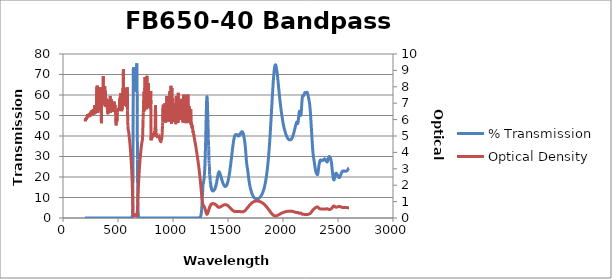
| Category | % Transmission |
|---|---|
| 2600.0 | 24.378 |
| 2599.0 | 24.358 |
| 2598.0 | 24.295 |
| 2597.0 | 24.212 |
| 2596.0 | 24.119 |
| 2595.0 | 24.054 |
| 2594.0 | 23.983 |
| 2593.0 | 23.907 |
| 2592.0 | 23.822 |
| 2591.0 | 23.744 |
| 2590.0 | 23.647 |
| 2589.0 | 23.537 |
| 2588.0 | 23.453 |
| 2587.0 | 23.376 |
| 2586.0 | 23.321 |
| 2585.0 | 23.246 |
| 2584.0 | 23.156 |
| 2583.0 | 23.119 |
| 2582.0 | 23.045 |
| 2581.0 | 23.02 |
| 2580.0 | 22.973 |
| 2579.0 | 22.931 |
| 2578.0 | 22.893 |
| 2577.0 | 22.862 |
| 2576.0 | 22.856 |
| 2575.0 | 22.855 |
| 2574.0 | 22.839 |
| 2573.0 | 22.817 |
| 2572.0 | 22.823 |
| 2571.0 | 22.839 |
| 2570.0 | 22.827 |
| 2569.0 | 22.824 |
| 2568.0 | 22.842 |
| 2567.0 | 22.84 |
| 2566.0 | 22.818 |
| 2565.0 | 22.806 |
| 2564.0 | 22.795 |
| 2563.0 | 22.834 |
| 2562.0 | 22.836 |
| 2561.0 | 22.842 |
| 2560.0 | 22.866 |
| 2559.0 | 22.865 |
| 2558.0 | 22.925 |
| 2557.0 | 22.911 |
| 2556.0 | 22.906 |
| 2555.0 | 22.902 |
| 2554.0 | 22.909 |
| 2553.0 | 22.852 |
| 2552.0 | 22.878 |
| 2551.0 | 22.9 |
| 2550.0 | 22.92 |
| 2549.0 | 22.937 |
| 2548.0 | 22.905 |
| 2547.0 | 22.926 |
| 2546.0 | 22.928 |
| 2545.0 | 22.931 |
| 2544.0 | 22.917 |
| 2543.0 | 22.892 |
| 2542.0 | 22.882 |
| 2541.0 | 22.836 |
| 2540.0 | 22.826 |
| 2539.0 | 22.757 |
| 2538.0 | 22.673 |
| 2537.0 | 22.585 |
| 2536.0 | 22.52 |
| 2535.0 | 22.4 |
| 2534.0 | 22.285 |
| 2533.0 | 22.171 |
| 2532.0 | 22.087 |
| 2531.0 | 21.934 |
| 2530.0 | 21.81 |
| 2529.0 | 21.665 |
| 2528.0 | 21.497 |
| 2527.0 | 21.329 |
| 2526.0 | 21.18 |
| 2525.0 | 21.031 |
| 2524.0 | 20.87 |
| 2523.0 | 20.737 |
| 2522.0 | 20.592 |
| 2521.0 | 20.459 |
| 2520.0 | 20.315 |
| 2519.0 | 20.189 |
| 2518.0 | 20.079 |
| 2517.0 | 19.974 |
| 2516.0 | 19.886 |
| 2515.0 | 19.852 |
| 2514.0 | 19.778 |
| 2513.0 | 19.737 |
| 2512.0 | 19.726 |
| 2511.0 | 19.712 |
| 2510.0 | 19.719 |
| 2509.0 | 19.75 |
| 2508.0 | 19.771 |
| 2507.0 | 19.823 |
| 2506.0 | 19.893 |
| 2505.0 | 19.991 |
| 2504.0 | 20.06 |
| 2503.0 | 20.154 |
| 2502.0 | 20.272 |
| 2501.0 | 20.374 |
| 2500.0 | 20.478 |
| 2499.0 | 20.581 |
| 2498.0 | 20.702 |
| 2497.0 | 20.781 |
| 2496.0 | 20.891 |
| 2495.0 | 20.991 |
| 2494.0 | 21.096 |
| 2493.0 | 21.192 |
| 2492.0 | 21.298 |
| 2491.0 | 21.382 |
| 2490.0 | 21.456 |
| 2489.0 | 21.557 |
| 2488.0 | 21.64 |
| 2487.0 | 21.694 |
| 2486.0 | 21.761 |
| 2485.0 | 21.833 |
| 2484.0 | 21.852 |
| 2483.0 | 21.881 |
| 2482.0 | 21.888 |
| 2481.0 | 21.847 |
| 2480.0 | 21.781 |
| 2479.0 | 21.716 |
| 2478.0 | 21.596 |
| 2477.0 | 21.432 |
| 2476.0 | 21.277 |
| 2475.0 | 21.057 |
| 2474.0 | 20.819 |
| 2473.0 | 20.6 |
| 2472.0 | 20.331 |
| 2471.0 | 20.071 |
| 2470.0 | 19.803 |
| 2469.0 | 19.543 |
| 2468.0 | 19.3 |
| 2467.0 | 19.059 |
| 2466.0 | 18.877 |
| 2465.0 | 18.728 |
| 2464.0 | 18.626 |
| 2463.0 | 18.555 |
| 2462.0 | 18.572 |
| 2461.0 | 18.612 |
| 2460.0 | 18.72 |
| 2459.0 | 18.886 |
| 2458.0 | 19.1 |
| 2457.0 | 19.383 |
| 2456.0 | 19.694 |
| 2455.0 | 20.058 |
| 2454.0 | 20.438 |
| 2453.0 | 20.856 |
| 2452.0 | 21.313 |
| 2451.0 | 21.756 |
| 2450.0 | 22.224 |
| 2449.0 | 22.707 |
| 2448.0 | 23.206 |
| 2447.0 | 23.7 |
| 2446.0 | 24.197 |
| 2445.0 | 24.67 |
| 2444.0 | 25.188 |
| 2443.0 | 25.661 |
| 2442.0 | 26.164 |
| 2441.0 | 26.6 |
| 2440.0 | 27.022 |
| 2439.0 | 27.39 |
| 2438.0 | 27.689 |
| 2437.0 | 28.03 |
| 2436.0 | 28.297 |
| 2435.0 | 28.575 |
| 2434.0 | 28.794 |
| 2433.0 | 28.993 |
| 2432.0 | 29.167 |
| 2431.0 | 29.333 |
| 2430.0 | 29.461 |
| 2429.0 | 29.568 |
| 2428.0 | 29.677 |
| 2427.0 | 29.774 |
| 2426.0 | 29.847 |
| 2425.0 | 29.883 |
| 2424.0 | 29.961 |
| 2423.0 | 29.976 |
| 2422.0 | 29.987 |
| 2421.0 | 29.982 |
| 2420.0 | 29.941 |
| 2419.0 | 29.921 |
| 2418.0 | 29.835 |
| 2417.0 | 29.765 |
| 2416.0 | 29.658 |
| 2415.0 | 29.574 |
| 2414.0 | 29.428 |
| 2413.0 | 29.282 |
| 2412.0 | 29.08 |
| 2411.0 | 28.844 |
| 2410.0 | 28.648 |
| 2409.0 | 28.432 |
| 2408.0 | 28.198 |
| 2407.0 | 28.005 |
| 2406.0 | 27.775 |
| 2405.0 | 27.638 |
| 2404.0 | 27.5 |
| 2403.0 | 27.395 |
| 2402.0 | 27.331 |
| 2401.0 | 27.276 |
| 2400.0 | 27.304 |
| 2399.0 | 27.321 |
| 2398.0 | 27.364 |
| 2397.0 | 27.464 |
| 2396.0 | 27.539 |
| 2395.0 | 27.623 |
| 2394.0 | 27.724 |
| 2393.0 | 27.79 |
| 2392.0 | 27.89 |
| 2391.0 | 27.965 |
| 2390.0 | 28.05 |
| 2389.0 | 28.126 |
| 2388.0 | 28.224 |
| 2387.0 | 28.305 |
| 2386.0 | 28.384 |
| 2385.0 | 28.489 |
| 2384.0 | 28.597 |
| 2383.0 | 28.652 |
| 2382.0 | 28.751 |
| 2381.0 | 28.787 |
| 2380.0 | 28.817 |
| 2379.0 | 28.843 |
| 2378.0 | 28.848 |
| 2377.0 | 28.844 |
| 2376.0 | 28.786 |
| 2375.0 | 28.754 |
| 2374.0 | 28.666 |
| 2373.0 | 28.568 |
| 2372.0 | 28.511 |
| 2371.0 | 28.45 |
| 2370.0 | 28.361 |
| 2369.0 | 28.311 |
| 2368.0 | 28.251 |
| 2367.0 | 28.198 |
| 2366.0 | 28.182 |
| 2365.0 | 28.135 |
| 2364.0 | 28.131 |
| 2363.0 | 28.149 |
| 2362.0 | 28.172 |
| 2361.0 | 28.191 |
| 2360.0 | 28.212 |
| 2359.0 | 28.223 |
| 2358.0 | 28.249 |
| 2357.0 | 28.214 |
| 2356.0 | 28.162 |
| 2355.0 | 28.111 |
| 2354.0 | 28.069 |
| 2353.0 | 27.991 |
| 2352.0 | 27.946 |
| 2351.0 | 27.972 |
| 2350.0 | 27.957 |
| 2349.0 | 27.965 |
| 2348.0 | 28.033 |
| 2347.0 | 28.068 |
| 2346.0 | 28.117 |
| 2345.0 | 28.141 |
| 2344.0 | 28.194 |
| 2343.0 | 28.225 |
| 2342.0 | 28.268 |
| 2341.0 | 28.309 |
| 2340.0 | 28.261 |
| 2339.0 | 28.181 |
| 2338.0 | 28.082 |
| 2337.0 | 27.984 |
| 2336.0 | 27.871 |
| 2335.0 | 27.684 |
| 2334.0 | 27.554 |
| 2333.0 | 27.33 |
| 2332.0 | 27.085 |
| 2331.0 | 26.86 |
| 2330.0 | 26.602 |
| 2329.0 | 26.325 |
| 2328.0 | 26.027 |
| 2327.0 | 25.667 |
| 2326.0 | 25.318 |
| 2325.0 | 24.913 |
| 2324.0 | 24.511 |
| 2323.0 | 24.094 |
| 2322.0 | 23.641 |
| 2321.0 | 23.204 |
| 2320.0 | 22.741 |
| 2319.0 | 22.348 |
| 2318.0 | 22.005 |
| 2317.0 | 21.689 |
| 2316.0 | 21.444 |
| 2315.0 | 21.268 |
| 2314.0 | 21.154 |
| 2313.0 | 21.135 |
| 2312.0 | 21.124 |
| 2311.0 | 21.141 |
| 2310.0 | 21.235 |
| 2309.0 | 21.298 |
| 2308.0 | 21.37 |
| 2307.0 | 21.492 |
| 2306.0 | 21.589 |
| 2305.0 | 21.685 |
| 2304.0 | 21.823 |
| 2303.0 | 21.943 |
| 2302.0 | 22.048 |
| 2301.0 | 22.23 |
| 2300.0 | 22.412 |
| 2299.0 | 22.566 |
| 2298.0 | 22.826 |
| 2297.0 | 23.035 |
| 2296.0 | 23.296 |
| 2295.0 | 23.598 |
| 2294.0 | 23.866 |
| 2293.0 | 24.167 |
| 2292.0 | 24.521 |
| 2291.0 | 24.84 |
| 2290.0 | 25.175 |
| 2289.0 | 25.549 |
| 2288.0 | 25.895 |
| 2287.0 | 26.29 |
| 2286.0 | 26.679 |
| 2285.0 | 27.051 |
| 2284.0 | 27.41 |
| 2283.0 | 27.811 |
| 2282.0 | 28.153 |
| 2281.0 | 28.495 |
| 2280.0 | 28.856 |
| 2279.0 | 29.176 |
| 2278.0 | 29.506 |
| 2277.0 | 29.854 |
| 2276.0 | 30.256 |
| 2275.0 | 30.623 |
| 2274.0 | 31.081 |
| 2273.0 | 31.599 |
| 2272.0 | 32.161 |
| 2271.0 | 32.816 |
| 2270.0 | 33.456 |
| 2269.0 | 34.212 |
| 2268.0 | 35.009 |
| 2267.0 | 35.823 |
| 2266.0 | 36.666 |
| 2265.0 | 37.587 |
| 2264.0 | 38.478 |
| 2263.0 | 39.314 |
| 2262.0 | 40.259 |
| 2261.0 | 41.133 |
| 2260.0 | 42.008 |
| 2259.0 | 42.918 |
| 2258.0 | 43.807 |
| 2257.0 | 44.687 |
| 2256.0 | 45.557 |
| 2255.0 | 46.48 |
| 2254.0 | 47.301 |
| 2253.0 | 48.158 |
| 2252.0 | 49.021 |
| 2251.0 | 49.855 |
| 2250.0 | 50.627 |
| 2249.0 | 51.415 |
| 2248.0 | 52.176 |
| 2247.0 | 52.869 |
| 2246.0 | 53.403 |
| 2245.0 | 54.049 |
| 2244.0 | 54.574 |
| 2243.0 | 55.116 |
| 2242.0 | 55.641 |
| 2241.0 | 56.02 |
| 2240.0 | 56.388 |
| 2239.0 | 56.798 |
| 2238.0 | 57.001 |
| 2237.0 | 57.409 |
| 2236.0 | 57.629 |
| 2235.0 | 57.902 |
| 2234.0 | 58.112 |
| 2233.0 | 58.386 |
| 2232.0 | 58.699 |
| 2231.0 | 58.913 |
| 2230.0 | 59.144 |
| 2229.0 | 59.479 |
| 2228.0 | 59.758 |
| 2227.0 | 59.97 |
| 2226.0 | 60.283 |
| 2225.0 | 60.451 |
| 2224.0 | 60.685 |
| 2223.0 | 60.855 |
| 2222.0 | 60.963 |
| 2221.0 | 61.122 |
| 2220.0 | 61.201 |
| 2219.0 | 61.216 |
| 2218.0 | 61.314 |
| 2217.0 | 61.245 |
| 2216.0 | 61.24 |
| 2215.0 | 61.243 |
| 2214.0 | 61.13 |
| 2213.0 | 61.117 |
| 2212.0 | 61.105 |
| 2211.0 | 61.009 |
| 2210.0 | 61.115 |
| 2209.0 | 61.02 |
| 2208.0 | 61.066 |
| 2207.0 | 61.044 |
| 2206.0 | 61.059 |
| 2205.0 | 61.098 |
| 2204.0 | 61.109 |
| 2203.0 | 61.115 |
| 2202.0 | 61.177 |
| 2201.0 | 61.165 |
| 2200.0 | 61.198 |
| 2199.0 | 61.136 |
| 2198.0 | 61.052 |
| 2197.0 | 61.004 |
| 2196.0 | 60.87 |
| 2195.0 | 60.745 |
| 2194.0 | 60.549 |
| 2193.0 | 60.372 |
| 2192.0 | 60.245 |
| 2191.0 | 60.078 |
| 2190.0 | 59.98 |
| 2189.0 | 59.93 |
| 2188.0 | 59.727 |
| 2187.0 | 59.788 |
| 2186.0 | 59.799 |
| 2185.0 | 59.78 |
| 2184.0 | 59.841 |
| 2183.0 | 59.832 |
| 2182.0 | 59.833 |
| 2181.0 | 59.789 |
| 2180.0 | 59.683 |
| 2179.0 | 59.579 |
| 2178.0 | 59.388 |
| 2177.0 | 59.188 |
| 2176.0 | 58.854 |
| 2175.0 | 58.442 |
| 2174.0 | 57.932 |
| 2173.0 | 57.361 |
| 2172.0 | 56.674 |
| 2171.0 | 55.883 |
| 2170.0 | 54.994 |
| 2169.0 | 54.071 |
| 2168.0 | 53.303 |
| 2167.0 | 52.43 |
| 2166.0 | 51.683 |
| 2165.0 | 51.033 |
| 2164.0 | 50.491 |
| 2163.0 | 50.221 |
| 2162.0 | 50.057 |
| 2161.0 | 50.042 |
| 2160.0 | 50.131 |
| 2159.0 | 50.37 |
| 2158.0 | 50.634 |
| 2157.0 | 50.944 |
| 2156.0 | 51.19 |
| 2155.0 | 51.522 |
| 2154.0 | 51.74 |
| 2153.0 | 51.961 |
| 2152.0 | 52.081 |
| 2151.0 | 52.132 |
| 2150.0 | 52.102 |
| 2149.0 | 51.999 |
| 2148.0 | 51.772 |
| 2147.0 | 51.508 |
| 2146.0 | 51.138 |
| 2145.0 | 50.713 |
| 2144.0 | 50.214 |
| 2143.0 | 49.752 |
| 2142.0 | 49.162 |
| 2141.0 | 48.573 |
| 2140.0 | 48.007 |
| 2139.0 | 47.513 |
| 2138.0 | 47.04 |
| 2137.0 | 46.643 |
| 2136.0 | 46.366 |
| 2135.0 | 46.145 |
| 2134.0 | 46.105 |
| 2133.0 | 46.077 |
| 2132.0 | 46.174 |
| 2131.0 | 46.354 |
| 2130.0 | 46.464 |
| 2129.0 | 46.641 |
| 2128.0 | 46.741 |
| 2127.0 | 46.846 |
| 2126.0 | 46.846 |
| 2125.0 | 46.768 |
| 2124.0 | 46.716 |
| 2123.0 | 46.59 |
| 2122.0 | 46.433 |
| 2121.0 | 46.239 |
| 2120.0 | 46.07 |
| 2119.0 | 45.882 |
| 2118.0 | 45.739 |
| 2117.0 | 45.525 |
| 2116.0 | 45.299 |
| 2115.0 | 45.1 |
| 2114.0 | 44.894 |
| 2113.0 | 44.66 |
| 2112.0 | 44.51 |
| 2111.0 | 44.234 |
| 2110.0 | 44.042 |
| 2109.0 | 43.827 |
| 2108.0 | 43.573 |
| 2107.0 | 43.399 |
| 2106.0 | 43.19 |
| 2105.0 | 42.945 |
| 2104.0 | 42.766 |
| 2103.0 | 42.55 |
| 2102.0 | 42.315 |
| 2101.0 | 42.058 |
| 2100.0 | 41.854 |
| 2099.0 | 41.678 |
| 2098.0 | 41.477 |
| 2097.0 | 41.245 |
| 2096.0 | 41.076 |
| 2095.0 | 40.851 |
| 2094.0 | 40.653 |
| 2093.0 | 40.489 |
| 2092.0 | 40.356 |
| 2091.0 | 40.197 |
| 2090.0 | 39.99 |
| 2089.0 | 39.82 |
| 2088.0 | 39.707 |
| 2087.0 | 39.562 |
| 2086.0 | 39.353 |
| 2085.0 | 39.263 |
| 2084.0 | 39.143 |
| 2083.0 | 39.046 |
| 2082.0 | 38.932 |
| 2081.0 | 38.824 |
| 2080.0 | 38.725 |
| 2079.0 | 38.68 |
| 2078.0 | 38.578 |
| 2077.0 | 38.52 |
| 2076.0 | 38.509 |
| 2075.0 | 38.41 |
| 2074.0 | 38.382 |
| 2073.0 | 38.339 |
| 2072.0 | 38.306 |
| 2071.0 | 38.272 |
| 2070.0 | 38.25 |
| 2069.0 | 38.198 |
| 2068.0 | 38.149 |
| 2067.0 | 38.183 |
| 2066.0 | 38.173 |
| 2065.0 | 38.161 |
| 2064.0 | 38.163 |
| 2063.0 | 38.145 |
| 2062.0 | 38.178 |
| 2061.0 | 38.206 |
| 2060.0 | 38.2 |
| 2059.0 | 38.202 |
| 2058.0 | 38.209 |
| 2057.0 | 38.189 |
| 2056.0 | 38.219 |
| 2055.0 | 38.237 |
| 2054.0 | 38.228 |
| 2053.0 | 38.286 |
| 2052.0 | 38.313 |
| 2051.0 | 38.381 |
| 2050.0 | 38.41 |
| 2049.0 | 38.487 |
| 2048.0 | 38.568 |
| 2047.0 | 38.606 |
| 2046.0 | 38.696 |
| 2045.0 | 38.722 |
| 2044.0 | 38.795 |
| 2043.0 | 38.877 |
| 2042.0 | 38.924 |
| 2041.0 | 39.036 |
| 2040.0 | 39.123 |
| 2039.0 | 39.191 |
| 2038.0 | 39.321 |
| 2037.0 | 39.48 |
| 2036.0 | 39.565 |
| 2035.0 | 39.726 |
| 2034.0 | 39.811 |
| 2033.0 | 39.975 |
| 2032.0 | 40.058 |
| 2031.0 | 40.2 |
| 2030.0 | 40.37 |
| 2029.0 | 40.467 |
| 2028.0 | 40.623 |
| 2027.0 | 40.751 |
| 2026.0 | 40.911 |
| 2025.0 | 41.044 |
| 2024.0 | 41.215 |
| 2023.0 | 41.421 |
| 2022.0 | 41.586 |
| 2021.0 | 41.784 |
| 2020.0 | 41.95 |
| 2019.0 | 42.116 |
| 2018.0 | 42.274 |
| 2017.0 | 42.496 |
| 2016.0 | 42.65 |
| 2015.0 | 42.855 |
| 2014.0 | 43.051 |
| 2013.0 | 43.23 |
| 2012.0 | 43.447 |
| 2011.0 | 43.653 |
| 2010.0 | 43.92 |
| 2009.0 | 44.183 |
| 2008.0 | 44.429 |
| 2007.0 | 44.664 |
| 2006.0 | 44.94 |
| 2005.0 | 45.197 |
| 2004.0 | 45.465 |
| 2003.0 | 45.698 |
| 2002.0 | 45.956 |
| 2001.0 | 46.257 |
| 2000.0 | 46.562 |
| 1999.0 | 46.907 |
| 1998.0 | 47.186 |
| 1997.0 | 47.539 |
| 1996.0 | 47.851 |
| 1995.0 | 48.211 |
| 1994.0 | 48.529 |
| 1993.0 | 48.841 |
| 1992.0 | 49.192 |
| 1991.0 | 49.573 |
| 1990.0 | 49.876 |
| 1989.0 | 50.255 |
| 1988.0 | 50.612 |
| 1987.0 | 50.955 |
| 1986.0 | 51.344 |
| 1985.0 | 51.779 |
| 1984.0 | 52.215 |
| 1983.0 | 52.583 |
| 1982.0 | 53.046 |
| 1981.0 | 53.427 |
| 1980.0 | 53.88 |
| 1979.0 | 54.265 |
| 1978.0 | 54.736 |
| 1977.0 | 55.164 |
| 1976.0 | 55.681 |
| 1975.0 | 56.078 |
| 1974.0 | 56.647 |
| 1973.0 | 57.044 |
| 1972.0 | 57.516 |
| 1971.0 | 58.026 |
| 1970.0 | 58.531 |
| 1969.0 | 59.005 |
| 1968.0 | 59.567 |
| 1967.0 | 60.044 |
| 1966.0 | 60.604 |
| 1965.0 | 61.159 |
| 1964.0 | 61.637 |
| 1963.0 | 62.221 |
| 1962.0 | 62.749 |
| 1961.0 | 63.25 |
| 1960.0 | 63.834 |
| 1959.0 | 64.422 |
| 1958.0 | 64.909 |
| 1957.0 | 65.487 |
| 1956.0 | 66.05 |
| 1955.0 | 66.618 |
| 1954.0 | 67.112 |
| 1953.0 | 67.644 |
| 1952.0 | 68.121 |
| 1951.0 | 68.734 |
| 1950.0 | 69.177 |
| 1949.0 | 69.733 |
| 1948.0 | 70.154 |
| 1947.0 | 70.666 |
| 1946.0 | 71.061 |
| 1945.0 | 71.497 |
| 1944.0 | 71.871 |
| 1943.0 | 72.282 |
| 1942.0 | 72.624 |
| 1941.0 | 72.952 |
| 1940.0 | 73.275 |
| 1939.0 | 73.592 |
| 1938.0 | 73.85 |
| 1937.0 | 74.141 |
| 1936.0 | 74.283 |
| 1935.0 | 74.46 |
| 1934.0 | 74.594 |
| 1933.0 | 74.699 |
| 1932.0 | 74.67 |
| 1931.0 | 74.739 |
| 1930.0 | 74.683 |
| 1929.0 | 74.613 |
| 1928.0 | 74.507 |
| 1927.0 | 74.345 |
| 1926.0 | 74.159 |
| 1925.0 | 73.946 |
| 1924.0 | 73.626 |
| 1923.0 | 73.366 |
| 1922.0 | 72.909 |
| 1921.0 | 72.48 |
| 1920.0 | 71.952 |
| 1919.0 | 71.604 |
| 1918.0 | 71.021 |
| 1917.0 | 70.415 |
| 1916.0 | 69.835 |
| 1915.0 | 69.117 |
| 1914.0 | 68.41 |
| 1913.0 | 67.655 |
| 1912.0 | 66.933 |
| 1911.0 | 66.204 |
| 1910.0 | 65.304 |
| 1909.0 | 64.582 |
| 1908.0 | 63.653 |
| 1907.0 | 62.824 |
| 1906.0 | 61.825 |
| 1905.0 | 60.965 |
| 1904.0 | 60.027 |
| 1903.0 | 59.16 |
| 1902.0 | 58.168 |
| 1901.0 | 57.286 |
| 1900.0 | 56.241 |
| 1899.0 | 55.373 |
| 1898.0 | 54.388 |
| 1897.0 | 53.527 |
| 1896.0 | 52.52 |
| 1895.0 | 51.585 |
| 1894.0 | 50.569 |
| 1893.0 | 49.699 |
| 1892.0 | 48.676 |
| 1891.0 | 47.831 |
| 1890.0 | 46.846 |
| 1889.0 | 45.937 |
| 1888.0 | 44.991 |
| 1887.0 | 44.171 |
| 1886.0 | 43.225 |
| 1885.0 | 42.333 |
| 1884.0 | 41.448 |
| 1883.0 | 40.598 |
| 1882.0 | 39.743 |
| 1881.0 | 38.945 |
| 1880.0 | 38.137 |
| 1879.0 | 37.35 |
| 1878.0 | 36.555 |
| 1877.0 | 35.797 |
| 1876.0 | 35.025 |
| 1875.0 | 34.252 |
| 1874.0 | 33.569 |
| 1873.0 | 32.826 |
| 1872.0 | 32.127 |
| 1871.0 | 31.437 |
| 1870.0 | 30.779 |
| 1869.0 | 30.103 |
| 1868.0 | 29.509 |
| 1867.0 | 28.898 |
| 1866.0 | 28.326 |
| 1865.0 | 27.738 |
| 1864.0 | 27.198 |
| 1863.0 | 26.634 |
| 1862.0 | 26.087 |
| 1861.0 | 25.608 |
| 1860.0 | 25.057 |
| 1859.0 | 24.594 |
| 1858.0 | 24.11 |
| 1857.0 | 23.653 |
| 1856.0 | 23.142 |
| 1855.0 | 22.72 |
| 1854.0 | 22.254 |
| 1853.0 | 21.863 |
| 1852.0 | 21.486 |
| 1851.0 | 21.108 |
| 1850.0 | 20.709 |
| 1849.0 | 20.267 |
| 1848.0 | 19.917 |
| 1847.0 | 19.55 |
| 1846.0 | 19.256 |
| 1845.0 | 18.912 |
| 1844.0 | 18.567 |
| 1843.0 | 18.221 |
| 1842.0 | 17.93 |
| 1841.0 | 17.644 |
| 1840.0 | 17.37 |
| 1839.0 | 17.096 |
| 1838.0 | 16.78 |
| 1837.0 | 16.512 |
| 1836.0 | 16.242 |
| 1835.0 | 16.021 |
| 1834.0 | 15.752 |
| 1833.0 | 15.523 |
| 1832.0 | 15.276 |
| 1831.0 | 15.058 |
| 1830.0 | 14.83 |
| 1829.0 | 14.634 |
| 1828.0 | 14.447 |
| 1827.0 | 14.219 |
| 1826.0 | 14.033 |
| 1825.0 | 13.854 |
| 1824.0 | 13.686 |
| 1823.0 | 13.515 |
| 1822.0 | 13.326 |
| 1821.0 | 13.168 |
| 1820.0 | 13.018 |
| 1819.0 | 12.878 |
| 1818.0 | 12.722 |
| 1817.0 | 12.578 |
| 1816.0 | 12.422 |
| 1815.0 | 12.296 |
| 1814.0 | 12.163 |
| 1813.0 | 12.053 |
| 1812.0 | 11.912 |
| 1811.0 | 11.788 |
| 1810.0 | 11.686 |
| 1809.0 | 11.561 |
| 1808.0 | 11.464 |
| 1807.0 | 11.352 |
| 1806.0 | 11.259 |
| 1805.0 | 11.156 |
| 1804.0 | 11.062 |
| 1803.0 | 10.975 |
| 1802.0 | 10.88 |
| 1801.0 | 10.805 |
| 1800.0 | 10.713 |
| 1799.0 | 10.631 |
| 1798.0 | 10.555 |
| 1797.0 | 10.491 |
| 1796.0 | 10.415 |
| 1795.0 | 10.342 |
| 1794.0 | 10.277 |
| 1793.0 | 10.213 |
| 1792.0 | 10.145 |
| 1791.0 | 10.089 |
| 1790.0 | 10.033 |
| 1789.0 | 9.985 |
| 1788.0 | 9.925 |
| 1787.0 | 9.884 |
| 1786.0 | 9.828 |
| 1785.0 | 9.781 |
| 1784.0 | 9.733 |
| 1783.0 | 9.692 |
| 1782.0 | 9.647 |
| 1781.0 | 9.607 |
| 1780.0 | 9.568 |
| 1779.0 | 9.525 |
| 1778.0 | 9.492 |
| 1777.0 | 9.462 |
| 1776.0 | 9.417 |
| 1775.0 | 9.385 |
| 1774.0 | 9.358 |
| 1773.0 | 9.333 |
| 1772.0 | 9.305 |
| 1771.0 | 9.288 |
| 1770.0 | 9.269 |
| 1769.0 | 9.262 |
| 1768.0 | 9.257 |
| 1767.0 | 9.251 |
| 1766.0 | 9.245 |
| 1765.0 | 9.256 |
| 1764.0 | 9.257 |
| 1763.0 | 9.282 |
| 1762.0 | 9.271 |
| 1761.0 | 9.286 |
| 1760.0 | 9.312 |
| 1759.0 | 9.318 |
| 1758.0 | 9.342 |
| 1757.0 | 9.349 |
| 1756.0 | 9.378 |
| 1755.0 | 9.39 |
| 1754.0 | 9.402 |
| 1753.0 | 9.419 |
| 1752.0 | 9.435 |
| 1751.0 | 9.46 |
| 1750.0 | 9.476 |
| 1749.0 | 9.491 |
| 1748.0 | 9.523 |
| 1747.0 | 9.533 |
| 1746.0 | 9.563 |
| 1745.0 | 9.584 |
| 1744.0 | 9.606 |
| 1743.0 | 9.641 |
| 1742.0 | 9.671 |
| 1741.0 | 9.697 |
| 1740.0 | 9.751 |
| 1739.0 | 9.789 |
| 1738.0 | 9.845 |
| 1737.0 | 9.901 |
| 1736.0 | 9.963 |
| 1735.0 | 10.044 |
| 1734.0 | 10.108 |
| 1733.0 | 10.185 |
| 1732.0 | 10.272 |
| 1731.0 | 10.357 |
| 1730.0 | 10.462 |
| 1729.0 | 10.552 |
| 1728.0 | 10.655 |
| 1727.0 | 10.765 |
| 1726.0 | 10.863 |
| 1725.0 | 10.971 |
| 1724.0 | 11.088 |
| 1723.0 | 11.201 |
| 1722.0 | 11.34 |
| 1721.0 | 11.473 |
| 1720.0 | 11.609 |
| 1719.0 | 11.771 |
| 1718.0 | 11.916 |
| 1717.0 | 12.1 |
| 1716.0 | 12.285 |
| 1715.0 | 12.449 |
| 1714.0 | 12.626 |
| 1713.0 | 12.789 |
| 1712.0 | 12.978 |
| 1711.0 | 13.151 |
| 1710.0 | 13.325 |
| 1709.0 | 13.51 |
| 1708.0 | 13.695 |
| 1707.0 | 13.868 |
| 1706.0 | 14.052 |
| 1705.0 | 14.239 |
| 1704.0 | 14.437 |
| 1703.0 | 14.652 |
| 1702.0 | 14.865 |
| 1701.0 | 15.1 |
| 1700.0 | 15.351 |
| 1699.0 | 15.611 |
| 1698.0 | 15.92 |
| 1697.0 | 16.236 |
| 1696.0 | 16.566 |
| 1695.0 | 16.888 |
| 1694.0 | 17.222 |
| 1693.0 | 17.548 |
| 1692.0 | 17.885 |
| 1691.0 | 18.196 |
| 1690.0 | 18.547 |
| 1689.0 | 18.897 |
| 1688.0 | 19.277 |
| 1687.0 | 19.685 |
| 1686.0 | 20.131 |
| 1685.0 | 20.595 |
| 1684.0 | 21.086 |
| 1683.0 | 21.593 |
| 1682.0 | 22.051 |
| 1681.0 | 22.512 |
| 1680.0 | 22.933 |
| 1679.0 | 23.337 |
| 1678.0 | 23.724 |
| 1677.0 | 24.091 |
| 1676.0 | 24.415 |
| 1675.0 | 24.744 |
| 1674.0 | 25.062 |
| 1673.0 | 25.379 |
| 1672.0 | 25.701 |
| 1671.0 | 26.116 |
| 1670.0 | 26.536 |
| 1669.0 | 27.02 |
| 1668.0 | 27.529 |
| 1667.0 | 28.178 |
| 1666.0 | 28.82 |
| 1665.0 | 29.538 |
| 1664.0 | 30.269 |
| 1663.0 | 30.995 |
| 1662.0 | 31.66 |
| 1661.0 | 32.37 |
| 1660.0 | 33.068 |
| 1659.0 | 33.716 |
| 1658.0 | 34.373 |
| 1657.0 | 34.907 |
| 1656.0 | 35.382 |
| 1655.0 | 35.808 |
| 1654.0 | 36.257 |
| 1653.0 | 36.718 |
| 1652.0 | 37.133 |
| 1651.0 | 37.591 |
| 1650.0 | 38.017 |
| 1649.0 | 38.354 |
| 1648.0 | 38.622 |
| 1647.0 | 38.865 |
| 1646.0 | 39.146 |
| 1645.0 | 39.439 |
| 1644.0 | 39.771 |
| 1643.0 | 40.182 |
| 1642.0 | 40.529 |
| 1641.0 | 40.863 |
| 1640.0 | 41.02 |
| 1639.0 | 41.074 |
| 1638.0 | 41.138 |
| 1637.0 | 41.183 |
| 1636.0 | 41.33 |
| 1635.0 | 41.526 |
| 1634.0 | 41.754 |
| 1633.0 | 41.947 |
| 1632.0 | 41.96 |
| 1631.0 | 41.91 |
| 1630.0 | 41.762 |
| 1629.0 | 41.726 |
| 1628.0 | 41.753 |
| 1627.0 | 41.866 |
| 1626.0 | 42.007 |
| 1625.0 | 42.108 |
| 1624.0 | 42.043 |
| 1623.0 | 41.865 |
| 1622.0 | 41.638 |
| 1621.0 | 41.414 |
| 1620.0 | 41.322 |
| 1619.0 | 41.356 |
| 1618.0 | 41.452 |
| 1617.0 | 41.571 |
| 1616.0 | 41.531 |
| 1615.0 | 41.373 |
| 1614.0 | 41.144 |
| 1613.0 | 40.871 |
| 1612.0 | 40.734 |
| 1611.0 | 40.75 |
| 1610.0 | 40.891 |
| 1609.0 | 41.019 |
| 1608.0 | 41.005 |
| 1607.0 | 40.839 |
| 1606.0 | 40.595 |
| 1605.0 | 40.363 |
| 1604.0 | 40.224 |
| 1603.0 | 40.227 |
| 1602.0 | 40.365 |
| 1601.0 | 40.508 |
| 1600.0 | 40.57 |
| 1599.0 | 40.497 |
| 1598.0 | 40.331 |
| 1597.0 | 40.137 |
| 1596.0 | 40.007 |
| 1595.0 | 40.044 |
| 1594.0 | 40.165 |
| 1593.0 | 40.334 |
| 1592.0 | 40.409 |
| 1591.0 | 40.428 |
| 1590.0 | 40.322 |
| 1589.0 | 40.192 |
| 1588.0 | 40.12 |
| 1587.0 | 40.137 |
| 1586.0 | 40.285 |
| 1585.0 | 40.383 |
| 1584.0 | 40.495 |
| 1583.0 | 40.576 |
| 1582.0 | 40.495 |
| 1581.0 | 40.437 |
| 1580.0 | 40.43 |
| 1579.0 | 40.433 |
| 1578.0 | 40.505 |
| 1577.0 | 40.624 |
| 1576.0 | 40.701 |
| 1575.0 | 40.742 |
| 1574.0 | 40.671 |
| 1573.0 | 40.657 |
| 1572.0 | 40.65 |
| 1571.0 | 40.649 |
| 1570.0 | 40.645 |
| 1569.0 | 40.664 |
| 1568.0 | 40.665 |
| 1567.0 | 40.586 |
| 1566.0 | 40.56 |
| 1565.0 | 40.413 |
| 1564.0 | 40.352 |
| 1563.0 | 40.271 |
| 1562.0 | 40.139 |
| 1561.0 | 40.011 |
| 1560.0 | 39.894 |
| 1559.0 | 39.699 |
| 1558.0 | 39.503 |
| 1557.0 | 39.296 |
| 1556.0 | 39.097 |
| 1555.0 | 38.849 |
| 1554.0 | 38.552 |
| 1553.0 | 38.281 |
| 1552.0 | 37.968 |
| 1551.0 | 37.658 |
| 1550.0 | 37.298 |
| 1549.0 | 36.964 |
| 1548.0 | 36.566 |
| 1547.0 | 36.197 |
| 1546.0 | 35.763 |
| 1545.0 | 35.356 |
| 1544.0 | 34.961 |
| 1543.0 | 34.557 |
| 1542.0 | 34.125 |
| 1541.0 | 33.677 |
| 1540.0 | 33.182 |
| 1539.0 | 32.69 |
| 1538.0 | 32.233 |
| 1537.0 | 31.8 |
| 1536.0 | 31.381 |
| 1535.0 | 30.987 |
| 1534.0 | 30.546 |
| 1533.0 | 30.017 |
| 1532.0 | 29.476 |
| 1531.0 | 28.959 |
| 1530.0 | 28.526 |
| 1529.0 | 28.166 |
| 1528.0 | 27.83 |
| 1527.0 | 27.443 |
| 1526.0 | 26.959 |
| 1525.0 | 26.413 |
| 1524.0 | 25.862 |
| 1523.0 | 25.378 |
| 1522.0 | 25.019 |
| 1521.0 | 24.728 |
| 1520.0 | 24.444 |
| 1519.0 | 24.092 |
| 1518.0 | 23.611 |
| 1517.0 | 23.059 |
| 1516.0 | 22.574 |
| 1515.0 | 22.23 |
| 1514.0 | 21.981 |
| 1513.0 | 21.806 |
| 1512.0 | 21.545 |
| 1511.0 | 21.173 |
| 1510.0 | 20.702 |
| 1509.0 | 20.265 |
| 1508.0 | 19.913 |
| 1507.0 | 19.684 |
| 1506.0 | 19.545 |
| 1505.0 | 19.376 |
| 1504.0 | 19.133 |
| 1503.0 | 18.775 |
| 1502.0 | 18.402 |
| 1501.0 | 18.093 |
| 1500.0 | 17.872 |
| 1499.0 | 17.77 |
| 1498.0 | 17.698 |
| 1497.0 | 17.536 |
| 1496.0 | 17.3 |
| 1495.0 | 17.001 |
| 1494.0 | 16.758 |
| 1493.0 | 16.591 |
| 1492.0 | 16.522 |
| 1491.0 | 16.482 |
| 1490.0 | 16.408 |
| 1489.0 | 16.251 |
| 1488.0 | 16.041 |
| 1487.0 | 15.877 |
| 1486.0 | 15.785 |
| 1485.0 | 15.747 |
| 1484.0 | 15.751 |
| 1483.0 | 15.722 |
| 1482.0 | 15.645 |
| 1481.0 | 15.536 |
| 1480.0 | 15.44 |
| 1479.0 | 15.402 |
| 1478.0 | 15.419 |
| 1477.0 | 15.454 |
| 1476.0 | 15.459 |
| 1475.0 | 15.456 |
| 1474.0 | 15.426 |
| 1473.0 | 15.406 |
| 1472.0 | 15.437 |
| 1471.0 | 15.478 |
| 1470.0 | 15.536 |
| 1469.0 | 15.604 |
| 1468.0 | 15.635 |
| 1467.0 | 15.669 |
| 1466.0 | 15.733 |
| 1465.0 | 15.808 |
| 1464.0 | 15.899 |
| 1463.0 | 15.995 |
| 1462.0 | 16.065 |
| 1461.0 | 16.168 |
| 1460.0 | 16.279 |
| 1459.0 | 16.397 |
| 1458.0 | 16.528 |
| 1457.0 | 16.629 |
| 1456.0 | 16.759 |
| 1455.0 | 16.865 |
| 1454.0 | 17.035 |
| 1453.0 | 17.21 |
| 1452.0 | 17.367 |
| 1451.0 | 17.516 |
| 1450.0 | 17.633 |
| 1449.0 | 17.764 |
| 1448.0 | 17.946 |
| 1447.0 | 18.181 |
| 1446.0 | 18.405 |
| 1445.0 | 18.549 |
| 1444.0 | 18.669 |
| 1443.0 | 18.751 |
| 1442.0 | 18.93 |
| 1441.0 | 19.188 |
| 1440.0 | 19.495 |
| 1439.0 | 19.74 |
| 1438.0 | 19.824 |
| 1437.0 | 19.851 |
| 1436.0 | 19.904 |
| 1435.0 | 20.131 |
| 1434.0 | 20.521 |
| 1433.0 | 20.843 |
| 1432.0 | 21.006 |
| 1431.0 | 20.977 |
| 1430.0 | 20.926 |
| 1429.0 | 21.021 |
| 1428.0 | 21.343 |
| 1427.0 | 21.721 |
| 1426.0 | 21.979 |
| 1425.0 | 22.051 |
| 1424.0 | 21.949 |
| 1423.0 | 21.853 |
| 1422.0 | 21.94 |
| 1421.0 | 22.161 |
| 1420.0 | 22.437 |
| 1419.0 | 22.556 |
| 1418.0 | 22.487 |
| 1417.0 | 22.237 |
| 1416.0 | 21.96 |
| 1415.0 | 21.793 |
| 1414.0 | 21.827 |
| 1413.0 | 21.951 |
| 1412.0 | 21.919 |
| 1411.0 | 21.626 |
| 1410.0 | 21.114 |
| 1409.0 | 20.614 |
| 1408.0 | 20.422 |
| 1407.0 | 20.396 |
| 1406.0 | 20.437 |
| 1405.0 | 20.178 |
| 1404.0 | 19.651 |
| 1403.0 | 19.04 |
| 1402.0 | 18.605 |
| 1401.0 | 18.481 |
| 1400.0 | 18.502 |
| 1399.0 | 18.383 |
| 1398.0 | 17.974 |
| 1397.0 | 17.352 |
| 1396.0 | 16.887 |
| 1395.0 | 16.732 |
| 1394.0 | 16.763 |
| 1393.0 | 16.654 |
| 1392.0 | 16.324 |
| 1391.0 | 15.915 |
| 1390.0 | 15.554 |
| 1389.0 | 15.39 |
| 1388.0 | 15.358 |
| 1387.0 | 15.317 |
| 1386.0 | 15.121 |
| 1385.0 | 14.799 |
| 1384.0 | 14.565 |
| 1383.0 | 14.426 |
| 1382.0 | 14.389 |
| 1381.0 | 14.353 |
| 1380.0 | 14.162 |
| 1379.0 | 14.009 |
| 1378.0 | 13.875 |
| 1377.0 | 13.828 |
| 1376.0 | 13.807 |
| 1375.0 | 13.734 |
| 1374.0 | 13.608 |
| 1373.0 | 13.501 |
| 1372.0 | 13.462 |
| 1371.0 | 13.458 |
| 1370.0 | 13.433 |
| 1369.0 | 13.367 |
| 1368.0 | 13.271 |
| 1367.0 | 13.271 |
| 1366.0 | 13.333 |
| 1365.0 | 13.347 |
| 1364.0 | 13.3 |
| 1363.0 | 13.226 |
| 1362.0 | 13.178 |
| 1361.0 | 13.291 |
| 1360.0 | 13.471 |
| 1359.0 | 13.507 |
| 1358.0 | 13.43 |
| 1357.0 | 13.327 |
| 1356.0 | 13.397 |
| 1355.0 | 13.661 |
| 1354.0 | 14 |
| 1353.0 | 14.119 |
| 1352.0 | 13.975 |
| 1351.0 | 13.882 |
| 1350.0 | 14.116 |
| 1349.0 | 14.654 |
| 1348.0 | 15.173 |
| 1347.0 | 15.316 |
| 1346.0 | 15.114 |
| 1345.0 | 15.054 |
| 1344.0 | 15.581 |
| 1343.0 | 16.453 |
| 1342.0 | 17.266 |
| 1341.0 | 17.417 |
| 1340.0 | 17.163 |
| 1339.0 | 17.266 |
| 1338.0 | 18.226 |
| 1337.0 | 19.682 |
| 1336.0 | 20.748 |
| 1335.0 | 20.895 |
| 1334.0 | 20.685 |
| 1333.0 | 21.199 |
| 1332.0 | 22.874 |
| 1331.0 | 24.984 |
| 1330.0 | 26.292 |
| 1329.0 | 26.502 |
| 1328.0 | 26.676 |
| 1327.0 | 28.04 |
| 1326.0 | 30.659 |
| 1325.0 | 33.273 |
| 1324.0 | 34.692 |
| 1323.0 | 35.407 |
| 1322.0 | 36.615 |
| 1321.0 | 38.896 |
| 1320.0 | 41.778 |
| 1319.0 | 44.365 |
| 1318.0 | 46.235 |
| 1317.0 | 47.925 |
| 1316.0 | 49.878 |
| 1315.0 | 51.953 |
| 1314.0 | 53.941 |
| 1313.0 | 55.905 |
| 1312.0 | 57.456 |
| 1311.0 | 58.413 |
| 1310.0 | 59.013 |
| 1309.0 | 59.2 |
| 1308.0 | 59.062 |
| 1307.0 | 58.507 |
| 1306.0 | 57.426 |
| 1305.0 | 56.003 |
| 1304.0 | 54.155 |
| 1303.0 | 51.988 |
| 1302.0 | 49.705 |
| 1301.0 | 47.509 |
| 1300.0 | 45.228 |
| 1299.0 | 42.658 |
| 1298.0 | 40.026 |
| 1297.0 | 37.51 |
| 1296.0 | 35.484 |
| 1295.0 | 33.81 |
| 1294.0 | 32.112 |
| 1293.0 | 30.278 |
| 1292.0 | 28.495 |
| 1291.0 | 26.883 |
| 1290.0 | 25.477 |
| 1289.0 | 24.369 |
| 1288.0 | 23.425 |
| 1287.0 | 22.569 |
| 1286.0 | 21.697 |
| 1285.0 | 20.717 |
| 1284.0 | 19.831 |
| 1283.0 | 19.223 |
| 1282.0 | 18.988 |
| 1281.0 | 18.847 |
| 1280.0 | 18.536 |
| 1279.0 | 18.01 |
| 1278.0 | 17.427 |
| 1277.0 | 17.072 |
| 1276.0 | 16.992 |
| 1275.0 | 17.079 |
| 1274.0 | 17.057 |
| 1273.0 | 16.669 |
| 1272.0 | 15.81 |
| 1271.0 | 14.576 |
| 1270.0 | 13.316 |
| 1269.0 | 12.302 |
| 1268.0 | 11.577 |
| 1267.0 | 10.794 |
| 1266.0 | 9.6 |
| 1265.0 | 8.135 |
| 1264.0 | 6.819 |
| 1263.0 | 5.833 |
| 1262.0 | 5.003 |
| 1261.0 | 4.258 |
| 1260.0 | 3.662 |
| 1259.0 | 3.127 |
| 1258.0 | 2.666 |
| 1257.0 | 2.247 |
| 1256.0 | 1.856 |
| 1255.0 | 1.526 |
| 1254.0 | 1.28 |
| 1253.0 | 1.103 |
| 1252.0 | 0.95 |
| 1251.0 | 0.809 |
| 1250.0 | 0.675 |
| 1249.0 | 0.562 |
| 1248.0 | 0.486 |
| 1247.0 | 0.426 |
| 1246.0 | 0.37 |
| 1245.0 | 0.315 |
| 1244.0 | 0.268 |
| 1243.0 | 0.231 |
| 1242.0 | 0.204 |
| 1241.0 | 0.181 |
| 1240.0 | 0.157 |
| 1239.0 | 0.135 |
| 1238.0 | 0.118 |
| 1237.0 | 0.105 |
| 1236.0 | 0.094 |
| 1235.0 | 0.083 |
| 1234.0 | 0.073 |
| 1233.0 | 0.064 |
| 1232.0 | 0.058 |
| 1231.0 | 0.052 |
| 1230.0 | 0.046 |
| 1229.0 | 0.041 |
| 1228.0 | 0.036 |
| 1227.0 | 0.033 |
| 1226.0 | 0.03 |
| 1225.0 | 0.027 |
| 1224.0 | 0.023 |
| 1223.0 | 0.021 |
| 1222.0 | 0.019 |
| 1221.0 | 0.017 |
| 1220.0 | 0.016 |
| 1219.0 | 0.014 |
| 1218.0 | 0.013 |
| 1217.0 | 0.012 |
| 1216.0 | 0.01 |
| 1215.0 | 0.009 |
| 1214.0 | 0.009 |
| 1213.0 | 0.008 |
| 1212.0 | 0.007 |
| 1211.0 | 0.006 |
| 1210.0 | 0.006 |
| 1209.0 | 0.005 |
| 1208.0 | 0.005 |
| 1207.0 | 0.004 |
| 1206.0 | 0.004 |
| 1205.0 | 0.004 |
| 1204.0 | 0.003 |
| 1203.0 | 0.003 |
| 1202.0 | 0.003 |
| 1201.0 | 0.002 |
| 1200.0 | 0.002 |
| 1199.0 | 0.002 |
| 1198.0 | 0.002 |
| 1197.0 | 0.002 |
| 1196.0 | 0.002 |
| 1195.0 | 0.001 |
| 1194.0 | 0.001 |
| 1193.0 | 0.001 |
| 1192.0 | 0.001 |
| 1191.0 | 0.001 |
| 1190.0 | 0.001 |
| 1189.0 | 0.001 |
| 1188.0 | 0.001 |
| 1187.0 | 0.001 |
| 1186.0 | 0.001 |
| 1185.0 | 0.001 |
| 1184.0 | 0 |
| 1183.0 | 0.001 |
| 1182.0 | 0.001 |
| 1181.0 | 0 |
| 1180.0 | 0 |
| 1179.0 | 0 |
| 1178.0 | 0 |
| 1177.0 | 0 |
| 1176.0 | 0 |
| 1175.0 | 0 |
| 1174.0 | 0 |
| 1173.0 | 0 |
| 1172.0 | 0 |
| 1171.0 | 0 |
| 1170.0 | 0 |
| 1169.0 | 0 |
| 1168.0 | 0 |
| 1167.0 | 0 |
| 1166.0 | 0 |
| 1165.0 | 0 |
| 1164.0 | 0 |
| 1163.0 | 0 |
| 1162.0 | 0 |
| 1161.0 | 0 |
| 1160.0 | 0 |
| 1159.0 | 0 |
| 1158.0 | 0 |
| 1157.0 | 0 |
| 1156.0 | 0 |
| 1155.0 | 0 |
| 1154.0 | 0 |
| 1153.0 | 0 |
| 1152.0 | 0 |
| 1151.0 | 0 |
| 1150.0 | 0 |
| 1149.0 | 0 |
| 1148.0 | 0 |
| 1147.0 | 0 |
| 1146.0 | 0 |
| 1145.0 | 0 |
| 1144.0 | 0 |
| 1143.0 | 0 |
| 1142.0 | 0 |
| 1141.0 | 0 |
| 1140.0 | 0 |
| 1139.0 | 0 |
| 1138.0 | 0 |
| 1137.0 | 0 |
| 1136.0 | 0 |
| 1135.0 | 0 |
| 1134.0 | 0 |
| 1133.0 | 0 |
| 1132.0 | 0 |
| 1131.0 | 0 |
| 1130.0 | 0 |
| 1129.0 | 0 |
| 1128.0 | 0 |
| 1127.0 | 0 |
| 1126.0 | 0 |
| 1125.0 | 0 |
| 1124.0 | 0 |
| 1123.0 | 0 |
| 1122.0 | 0 |
| 1121.0 | 0 |
| 1120.0 | 0 |
| 1119.0 | 0 |
| 1118.0 | 0 |
| 1117.0 | 0 |
| 1116.0 | 0 |
| 1115.0 | 0 |
| 1114.0 | 0 |
| 1113.0 | 0 |
| 1112.0 | 0 |
| 1111.0 | 0 |
| 1110.0 | 0 |
| 1109.0 | 0 |
| 1108.0 | 0 |
| 1107.0 | 0 |
| 1106.0 | 0 |
| 1105.0 | 0 |
| 1104.0 | 0 |
| 1103.0 | 0 |
| 1102.0 | 0 |
| 1101.0 | 0 |
| 1100.0 | 0 |
| 1099.0 | 0 |
| 1098.0 | 0 |
| 1097.0 | 0 |
| 1096.0 | 0 |
| 1095.0 | 0 |
| 1094.0 | 0 |
| 1093.0 | 0 |
| 1092.0 | 0 |
| 1091.0 | 0 |
| 1090.0 | 0 |
| 1089.0 | 0 |
| 1088.0 | 0 |
| 1087.0 | 0 |
| 1086.0 | 0 |
| 1085.0 | 0 |
| 1084.0 | 0 |
| 1083.0 | 0 |
| 1082.0 | 0 |
| 1081.0 | 0 |
| 1080.0 | 0 |
| 1079.0 | 0 |
| 1078.0 | 0 |
| 1077.0 | 0 |
| 1076.0 | 0 |
| 1075.0 | 0 |
| 1074.0 | 0 |
| 1073.0 | 0 |
| 1072.0 | 0 |
| 1071.0 | 0 |
| 1070.0 | 0 |
| 1069.0 | 0 |
| 1068.0 | 0 |
| 1067.0 | 0 |
| 1066.0 | 0 |
| 1065.0 | 0 |
| 1064.0 | 0 |
| 1063.0 | 0 |
| 1062.0 | 0 |
| 1061.0 | 0 |
| 1060.0 | 0 |
| 1059.0 | 0 |
| 1058.0 | 0 |
| 1057.0 | 0 |
| 1056.0 | 0 |
| 1055.0 | 0 |
| 1054.0 | 0 |
| 1053.0 | 0 |
| 1052.0 | 0 |
| 1051.0 | 0 |
| 1050.0 | 0 |
| 1049.0 | 0 |
| 1048.0 | 0 |
| 1047.0 | 0 |
| 1046.0 | 0 |
| 1045.0 | 0 |
| 1044.0 | 0 |
| 1043.0 | 0 |
| 1042.0 | 0 |
| 1041.0 | 0 |
| 1040.0 | 0 |
| 1039.0 | 0 |
| 1038.0 | 0 |
| 1037.0 | 0 |
| 1036.0 | 0 |
| 1035.0 | 0 |
| 1034.0 | 0 |
| 1033.0 | 0 |
| 1032.0 | 0 |
| 1031.0 | 0 |
| 1030.0 | 0 |
| 1029.0 | 0 |
| 1028.0 | 0 |
| 1027.0 | 0 |
| 1026.0 | 0 |
| 1025.0 | 0 |
| 1024.0 | 0 |
| 1023.0 | 0 |
| 1022.0 | 0 |
| 1021.0 | 0 |
| 1020.0 | 0 |
| 1019.0 | 0 |
| 1018.0 | 0 |
| 1017.0 | 0 |
| 1016.0 | 0 |
| 1015.0 | 0 |
| 1014.0 | 0 |
| 1013.0 | 0 |
| 1012.0 | 0 |
| 1011.0 | 0 |
| 1010.0 | 0 |
| 1009.0 | 0 |
| 1008.0 | 0 |
| 1007.0 | 0 |
| 1006.0 | 0 |
| 1005.0 | 0 |
| 1004.0 | 0 |
| 1003.0 | 0 |
| 1002.0 | 0 |
| 1001.0 | 0 |
| 1000.0 | 0 |
| 999.0 | 0 |
| 998.0 | 0 |
| 997.0 | 0 |
| 996.0 | 0 |
| 995.0 | 0 |
| 994.0 | 0 |
| 993.0 | 0 |
| 992.0 | 0 |
| 991.0 | 0 |
| 990.0 | 0 |
| 989.0 | 0 |
| 988.0 | 0 |
| 987.0 | 0 |
| 986.0 | 0 |
| 985.0 | 0 |
| 984.0 | 0 |
| 983.0 | 0 |
| 982.0 | 0 |
| 981.0 | 0 |
| 980.0 | 0 |
| 979.0 | 0 |
| 978.0 | 0 |
| 977.0 | 0 |
| 976.0 | 0 |
| 975.0 | 0 |
| 974.0 | 0 |
| 973.0 | 0 |
| 972.0 | 0 |
| 971.0 | 0 |
| 970.0 | 0 |
| 969.0 | 0 |
| 968.0 | 0 |
| 967.0 | 0 |
| 966.0 | 0 |
| 965.0 | 0 |
| 964.0 | 0 |
| 963.0 | 0 |
| 962.0 | 0 |
| 961.0 | 0 |
| 960.0 | 0 |
| 959.0 | 0 |
| 958.0 | 0 |
| 957.0 | 0 |
| 956.0 | 0 |
| 955.0 | 0 |
| 954.0 | 0 |
| 953.0 | 0 |
| 952.0 | 0 |
| 951.0 | 0 |
| 950.0 | 0 |
| 949.0 | 0 |
| 948.0 | 0 |
| 947.0 | 0 |
| 946.0 | 0 |
| 945.0 | 0 |
| 944.0 | 0 |
| 943.0 | 0 |
| 942.0 | 0 |
| 941.0 | 0 |
| 940.0 | 0 |
| 939.0 | 0 |
| 938.0 | 0 |
| 937.0 | 0 |
| 936.0 | 0 |
| 935.0 | 0 |
| 934.0 | 0 |
| 933.0 | 0 |
| 932.0 | 0 |
| 931.0 | 0 |
| 930.0 | 0 |
| 929.0 | 0 |
| 928.0 | 0 |
| 927.0 | 0 |
| 926.0 | 0 |
| 925.0 | 0 |
| 924.0 | 0 |
| 923.0 | 0 |
| 922.0 | 0 |
| 921.0 | 0 |
| 920.0 | 0 |
| 919.0 | 0 |
| 918.0 | 0 |
| 917.0 | 0 |
| 916.0 | 0 |
| 915.0 | 0 |
| 914.0 | 0 |
| 913.0 | 0 |
| 912.0 | 0 |
| 911.0 | 0 |
| 910.0 | 0 |
| 909.0 | 0 |
| 908.0 | 0 |
| 907.0 | 0 |
| 906.0 | 0 |
| 905.0 | 0 |
| 904.0 | 0 |
| 903.0 | 0 |
| 902.0 | 0.001 |
| 901.0 | 0.001 |
| 900.0 | 0.001 |
| 899.0 | 0.001 |
| 898.0 | 0.001 |
| 897.0 | 0.001 |
| 896.0 | 0.002 |
| 895.0 | 0.002 |
| 894.0 | 0.002 |
| 893.0 | 0.002 |
| 892.0 | 0.002 |
| 891.0 | 0.002 |
| 890.0 | 0.002 |
| 889.0 | 0.002 |
| 888.0 | 0.002 |
| 887.0 | 0.002 |
| 886.0 | 0.002 |
| 885.0 | 0.002 |
| 884.0 | 0.002 |
| 883.0 | 0.002 |
| 882.0 | 0.002 |
| 881.0 | 0.002 |
| 880.0 | 0.002 |
| 879.0 | 0.001 |
| 878.0 | 0.001 |
| 877.0 | 0.001 |
| 876.0 | 0.001 |
| 875.0 | 0.001 |
| 874.0 | 0.001 |
| 873.0 | 0.001 |
| 872.0 | 0.001 |
| 871.0 | 0.001 |
| 870.0 | 0.001 |
| 869.0 | 0.001 |
| 868.0 | 0.001 |
| 867.0 | 0.001 |
| 866.0 | 0.001 |
| 865.0 | 0.001 |
| 864.0 | 0.001 |
| 863.0 | 0.001 |
| 862.0 | 0.001 |
| 861.0 | 0.001 |
| 860.0 | 0.001 |
| 859.0 | 0.001 |
| 858.0 | 0.001 |
| 857.0 | 0.001 |
| 856.0 | 0.001 |
| 855.0 | 0.001 |
| 854.0 | 0.001 |
| 853.0 | 0.001 |
| 852.0 | 0.001 |
| 851.0 | 0.001 |
| 850.0 | 0.001 |
| 849.0 | 0.001 |
| 848.0 | 0.001 |
| 847.0 | 0.001 |
| 846.0 | 0.001 |
| 845.0 | 0 |
| 844.0 | 0 |
| 843.0 | 0 |
| 842.0 | 0 |
| 841.0 | 0 |
| 840.0 | 0 |
| 839.0 | 0 |
| 838.0 | 0 |
| 837.0 | 0 |
| 836.0 | 0.001 |
| 835.0 | 0.001 |
| 834.0 | 0.001 |
| 833.0 | 0.001 |
| 832.0 | 0.001 |
| 831.0 | 0.001 |
| 830.0 | 0.001 |
| 829.0 | 0.001 |
| 828.0 | 0.001 |
| 827.0 | 0.001 |
| 826.0 | 0.001 |
| 825.0 | 0.001 |
| 824.0 | 0.001 |
| 823.0 | 0.001 |
| 822.0 | 0.001 |
| 821.0 | 0.001 |
| 820.0 | 0.001 |
| 819.0 | 0.001 |
| 818.0 | 0.001 |
| 817.0 | 0.001 |
| 816.0 | 0.001 |
| 815.0 | 0.001 |
| 814.0 | 0.001 |
| 813.0 | 0.001 |
| 812.0 | 0.001 |
| 811.0 | 0.001 |
| 810.0 | 0.001 |
| 809.0 | 0.001 |
| 808.0 | 0.001 |
| 807.0 | 0.001 |
| 806.0 | 0.002 |
| 805.0 | 0.001 |
| 804.0 | 0.001 |
| 803.0 | 0.002 |
| 802.0 | 0.001 |
| 801.0 | 0.002 |
| 800.0 | 0.001 |
| 799.0 | 0 |
| 798.0 | 0 |
| 797.0 | 0 |
| 796.0 | 0 |
| 795.0 | 0 |
| 794.0 | 0 |
| 793.0 | 0 |
| 792.0 | 0 |
| 791.0 | 0 |
| 790.0 | 0 |
| 789.0 | 0 |
| 788.0 | 0 |
| 787.0 | 0 |
| 786.0 | 0 |
| 785.0 | 0 |
| 784.0 | 0 |
| 783.0 | 0 |
| 782.0 | 0 |
| 781.0 | 0 |
| 780.0 | 0 |
| 779.0 | 0 |
| 778.0 | 0 |
| 777.0 | 0 |
| 776.0 | 0 |
| 775.0 | 0 |
| 774.0 | 0 |
| 773.0 | 0 |
| 772.0 | 0 |
| 771.0 | 0 |
| 770.0 | 0 |
| 769.0 | 0 |
| 768.0 | 0 |
| 767.0 | 0 |
| 766.0 | 0 |
| 765.0 | 0 |
| 764.0 | 0 |
| 763.0 | 0 |
| 762.0 | 0 |
| 761.0 | 0 |
| 760.0 | 0 |
| 759.0 | 0 |
| 758.0 | 0 |
| 757.0 | 0 |
| 756.0 | 0 |
| 755.0 | 0 |
| 754.0 | 0 |
| 753.0 | 0 |
| 752.0 | 0 |
| 751.0 | 0 |
| 750.0 | 0 |
| 749.0 | 0 |
| 748.0 | 0 |
| 747.0 | 0 |
| 746.0 | 0 |
| 745.0 | 0 |
| 744.0 | 0 |
| 743.0 | 0 |
| 742.0 | 0 |
| 741.0 | 0 |
| 740.0 | 0 |
| 739.0 | 0 |
| 738.0 | 0 |
| 737.0 | 0 |
| 736.0 | 0 |
| 735.0 | 0 |
| 734.0 | 0 |
| 733.0 | 0 |
| 732.0 | 0 |
| 731.0 | 0 |
| 730.0 | 0 |
| 729.0 | 0 |
| 728.0 | 0 |
| 727.0 | 0 |
| 726.0 | 0 |
| 725.0 | 0.001 |
| 724.0 | 0.001 |
| 723.0 | 0.001 |
| 722.0 | 0.002 |
| 721.0 | 0.002 |
| 720.0 | 0.002 |
| 719.0 | 0.002 |
| 718.0 | 0.002 |
| 717.0 | 0.003 |
| 716.0 | 0.003 |
| 715.0 | 0.003 |
| 714.0 | 0.003 |
| 713.0 | 0.004 |
| 712.0 | 0.005 |
| 711.0 | 0.005 |
| 710.0 | 0.006 |
| 709.0 | 0.007 |
| 708.0 | 0.008 |
| 707.0 | 0.009 |
| 706.0 | 0.011 |
| 705.0 | 0.013 |
| 704.0 | 0.015 |
| 703.0 | 0.017 |
| 702.0 | 0.021 |
| 701.0 | 0.025 |
| 700.0 | 0.03 |
| 699.0 | 0.037 |
| 698.0 | 0.046 |
| 697.0 | 0.056 |
| 696.0 | 0.071 |
| 695.0 | 0.089 |
| 694.0 | 0.112 |
| 693.0 | 0.142 |
| 692.0 | 0.183 |
| 691.0 | 0.237 |
| 690.0 | 0.309 |
| 689.0 | 0.408 |
| 688.0 | 0.547 |
| 687.0 | 0.74 |
| 686.0 | 1.015 |
| 685.0 | 1.416 |
| 684.0 | 2.012 |
| 683.0 | 2.903 |
| 682.0 | 4.229 |
| 681.0 | 6.223 |
| 680.0 | 9.21 |
| 679.0 | 13.636 |
| 678.0 | 20.038 |
| 677.0 | 28.51 |
| 676.0 | 39.001 |
| 675.0 | 50.359 |
| 674.0 | 60.802 |
| 673.0 | 68.79 |
| 672.0 | 73.582 |
| 671.0 | 75.494 |
| 670.0 | 75.261 |
| 669.0 | 73.764 |
| 668.0 | 71.625 |
| 667.0 | 69.339 |
| 666.0 | 67.182 |
| 665.0 | 65.316 |
| 664.0 | 63.852 |
| 663.0 | 62.818 |
| 662.0 | 62.265 |
| 661.0 | 62.152 |
| 660.0 | 62.443 |
| 659.0 | 63.129 |
| 658.0 | 64.132 |
| 657.0 | 65.32 |
| 656.0 | 66.642 |
| 655.0 | 67.903 |
| 654.0 | 69.037 |
| 653.0 | 69.86 |
| 652.0 | 70.221 |
| 651.0 | 70.108 |
| 650.0 | 69.453 |
| 649.0 | 68.335 |
| 648.0 | 66.884 |
| 647.0 | 65.324 |
| 646.0 | 63.98 |
| 645.0 | 63.146 |
| 644.0 | 63.259 |
| 643.0 | 64.631 |
| 642.0 | 67.479 |
| 641.0 | 71.212 |
| 640.0 | 73.513 |
| 639.0 | 69.732 |
| 638.0 | 57.556 |
| 637.0 | 40.52 |
| 636.0 | 24.894 |
| 635.0 | 14.091 |
| 634.0 | 7.831 |
| 633.0 | 4.478 |
| 632.0 | 2.635 |
| 631.0 | 1.609 |
| 630.0 | 1.016 |
| 629.0 | 0.659 |
| 628.0 | 0.442 |
| 627.0 | 0.301 |
| 626.0 | 0.21 |
| 625.0 | 0.149 |
| 624.0 | 0.108 |
| 623.0 | 0.079 |
| 622.0 | 0.059 |
| 621.0 | 0.044 |
| 620.0 | 0.034 |
| 619.0 | 0.026 |
| 618.0 | 0.02 |
| 617.0 | 0.016 |
| 616.0 | 0.013 |
| 615.0 | 0.01 |
| 614.0 | 0.008 |
| 613.0 | 0.007 |
| 612.0 | 0.006 |
| 611.0 | 0.005 |
| 610.0 | 0.004 |
| 609.0 | 0.003 |
| 608.0 | 0.003 |
| 607.0 | 0.002 |
| 606.0 | 0.002 |
| 605.0 | 0.002 |
| 604.0 | 0.002 |
| 603.0 | 0.001 |
| 602.0 | 0.001 |
| 601.0 | 0.001 |
| 600.0 | 0.001 |
| 599.0 | 0.001 |
| 598.0 | 0.001 |
| 597.0 | 0.001 |
| 596.0 | 0 |
| 595.0 | 0 |
| 594.0 | 0 |
| 593.0 | 0 |
| 592.0 | 0 |
| 591.0 | 0 |
| 590.0 | 0 |
| 589.0 | 0 |
| 588.0 | 0 |
| 587.0 | 0 |
| 586.0 | 0 |
| 585.0 | 0 |
| 584.0 | 0 |
| 583.0 | 0 |
| 582.0 | 0 |
| 581.0 | 0 |
| 580.0 | 0 |
| 579.0 | 0 |
| 578.0 | 0 |
| 577.0 | 0 |
| 576.0 | 0 |
| 575.0 | 0 |
| 574.0 | 0 |
| 573.0 | 0 |
| 572.0 | 0 |
| 571.0 | 0 |
| 570.0 | 0 |
| 569.0 | 0 |
| 568.0 | 0 |
| 567.0 | 0 |
| 566.0 | 0 |
| 565.0 | 0 |
| 564.0 | 0 |
| 563.0 | 0 |
| 562.0 | 0 |
| 561.0 | 0 |
| 560.0 | 0 |
| 559.0 | 0 |
| 558.0 | 0 |
| 557.0 | 0 |
| 556.0 | 0 |
| 555.0 | 0 |
| 554.0 | 0 |
| 553.0 | 0 |
| 552.0 | 0 |
| 551.0 | 0 |
| 550.0 | 0 |
| 549.0 | 0 |
| 548.0 | 0 |
| 547.0 | 0 |
| 546.0 | 0 |
| 545.0 | 0 |
| 544.0 | 0 |
| 543.0 | 0 |
| 542.0 | 0 |
| 541.0 | 0 |
| 540.0 | 0 |
| 539.0 | 0 |
| 538.0 | 0 |
| 537.0 | 0 |
| 536.0 | 0 |
| 535.0 | 0 |
| 534.0 | 0 |
| 533.0 | 0 |
| 532.0 | 0 |
| 531.0 | 0 |
| 530.0 | 0 |
| 529.0 | 0 |
| 528.0 | 0 |
| 527.0 | 0 |
| 526.0 | 0 |
| 525.0 | 0 |
| 524.0 | 0 |
| 523.0 | 0 |
| 522.0 | 0 |
| 521.0 | 0 |
| 520.0 | 0 |
| 519.0 | 0 |
| 518.0 | 0 |
| 517.0 | 0 |
| 516.0 | 0 |
| 515.0 | 0 |
| 514.0 | 0 |
| 513.0 | 0 |
| 512.0 | 0 |
| 511.0 | 0 |
| 510.0 | 0 |
| 509.0 | 0 |
| 508.0 | 0 |
| 507.0 | 0 |
| 506.0 | 0 |
| 505.0 | 0 |
| 504.0 | 0 |
| 503.0 | 0 |
| 502.0 | 0 |
| 501.0 | 0 |
| 500.0 | 0 |
| 499.0 | 0 |
| 498.0 | 0 |
| 497.0 | 0 |
| 496.0 | 0 |
| 495.0 | 0 |
| 494.0 | 0 |
| 493.0 | 0 |
| 492.0 | 0 |
| 491.0 | 0 |
| 490.0 | 0 |
| 489.0 | 0 |
| 488.0 | 0 |
| 487.0 | 0 |
| 486.0 | 0 |
| 485.0 | 0 |
| 484.0 | 0 |
| 483.0 | 0 |
| 482.0 | 0 |
| 481.0 | 0 |
| 480.0 | 0 |
| 479.0 | 0 |
| 478.0 | 0 |
| 477.0 | 0 |
| 476.0 | 0 |
| 475.0 | 0 |
| 474.0 | 0 |
| 473.0 | 0 |
| 472.0 | 0 |
| 471.0 | 0 |
| 470.0 | 0 |
| 469.0 | 0 |
| 468.0 | 0 |
| 467.0 | 0 |
| 466.0 | 0 |
| 465.0 | 0 |
| 464.0 | 0 |
| 463.0 | 0 |
| 462.0 | 0 |
| 461.0 | 0 |
| 460.0 | 0 |
| 459.0 | 0 |
| 458.0 | 0 |
| 457.0 | 0 |
| 456.0 | 0 |
| 455.0 | 0 |
| 454.0 | 0 |
| 453.0 | 0 |
| 452.0 | 0 |
| 451.0 | 0 |
| 450.0 | 0 |
| 449.0 | 0 |
| 448.0 | 0 |
| 447.0 | 0 |
| 446.0 | 0 |
| 445.0 | 0 |
| 444.0 | 0 |
| 443.0 | 0 |
| 442.0 | 0 |
| 441.0 | 0 |
| 440.0 | 0 |
| 439.0 | 0 |
| 438.0 | 0 |
| 437.0 | 0 |
| 436.0 | 0 |
| 435.0 | 0 |
| 434.0 | 0 |
| 433.0 | 0 |
| 432.0 | 0 |
| 431.0 | 0 |
| 430.0 | 0 |
| 429.0 | 0 |
| 428.0 | 0 |
| 427.0 | 0 |
| 426.0 | 0 |
| 425.0 | 0 |
| 424.0 | 0 |
| 423.0 | 0 |
| 422.0 | 0 |
| 421.0 | 0 |
| 420.0 | 0 |
| 419.0 | 0 |
| 418.0 | 0 |
| 417.0 | 0 |
| 416.0 | 0 |
| 415.0 | 0 |
| 414.0 | 0 |
| 413.0 | 0 |
| 412.0 | 0 |
| 411.0 | 0 |
| 410.0 | 0 |
| 409.0 | 0 |
| 408.0 | 0 |
| 407.0 | 0 |
| 406.0 | 0 |
| 405.0 | 0 |
| 404.0 | 0 |
| 403.0 | 0 |
| 402.0 | 0 |
| 401.0 | 0 |
| 400.0 | 0 |
| 399.0 | 0 |
| 398.0 | 0 |
| 397.0 | 0 |
| 396.0 | 0 |
| 395.0 | 0 |
| 394.0 | 0 |
| 393.0 | 0 |
| 392.0 | 0 |
| 391.0 | 0 |
| 390.0 | 0 |
| 389.0 | 0 |
| 388.0 | 0 |
| 387.0 | 0 |
| 386.0 | 0 |
| 385.0 | 0 |
| 384.0 | 0 |
| 383.0 | 0 |
| 382.0 | 0 |
| 381.0 | 0 |
| 380.0 | 0 |
| 379.0 | 0 |
| 378.0 | 0 |
| 377.0 | 0 |
| 376.0 | 0 |
| 375.0 | 0 |
| 374.0 | 0 |
| 373.0 | 0 |
| 372.0 | 0 |
| 371.0 | 0 |
| 370.0 | 0 |
| 369.0 | 0 |
| 368.0 | 0 |
| 367.0 | 0 |
| 366.0 | 0 |
| 365.0 | 0 |
| 364.0 | 0 |
| 363.0 | 0 |
| 362.0 | 0 |
| 361.0 | 0 |
| 360.0 | 0 |
| 359.0 | 0 |
| 358.0 | 0 |
| 357.0 | 0 |
| 356.0 | 0 |
| 355.0 | 0 |
| 354.0 | 0 |
| 353.0 | 0 |
| 352.0 | 0 |
| 351.0 | 0 |
| 350.0 | 0 |
| 349.0 | 0 |
| 348.0 | 0 |
| 347.0 | 0 |
| 346.0 | 0 |
| 345.0 | 0 |
| 344.0 | 0 |
| 343.0 | 0 |
| 342.0 | 0 |
| 341.0 | 0 |
| 340.0 | 0 |
| 339.0 | 0 |
| 338.0 | 0 |
| 337.0 | 0 |
| 336.0 | 0 |
| 335.0 | 0 |
| 334.0 | 0 |
| 333.0 | 0 |
| 332.0 | 0 |
| 331.0 | 0 |
| 330.0 | 0 |
| 329.0 | 0 |
| 328.0 | 0 |
| 327.0 | 0 |
| 326.0 | 0 |
| 325.0 | 0 |
| 324.0 | 0 |
| 323.0 | 0 |
| 322.0 | 0 |
| 321.0 | 0 |
| 320.0 | 0 |
| 319.0 | 0 |
| 318.0 | 0 |
| 317.0 | 0 |
| 316.0 | 0 |
| 315.0 | 0 |
| 314.0 | 0 |
| 313.0 | 0 |
| 312.0 | 0 |
| 311.0 | 0 |
| 310.0 | 0 |
| 309.0 | 0 |
| 308.0 | 0 |
| 307.0 | 0 |
| 306.0 | 0 |
| 305.0 | 0 |
| 304.0 | 0 |
| 303.0 | 0 |
| 302.0 | 0 |
| 301.0 | 0 |
| 300.0 | 0 |
| 299.0 | 0 |
| 298.0 | 0 |
| 297.0 | 0 |
| 296.0 | 0 |
| 295.0 | 0 |
| 294.0 | 0 |
| 293.0 | 0 |
| 292.0 | 0 |
| 291.0 | 0 |
| 290.0 | 0 |
| 289.0 | 0 |
| 288.0 | 0 |
| 287.0 | 0 |
| 286.0 | 0 |
| 285.0 | 0 |
| 284.0 | 0 |
| 283.0 | 0 |
| 282.0 | 0 |
| 281.0 | 0 |
| 280.0 | 0 |
| 279.0 | 0 |
| 278.0 | 0 |
| 277.0 | 0 |
| 276.0 | 0 |
| 275.0 | 0 |
| 274.0 | 0 |
| 273.0 | 0 |
| 272.0 | 0 |
| 271.0 | 0 |
| 270.0 | 0 |
| 269.0 | 0 |
| 268.0 | 0 |
| 267.0 | 0 |
| 266.0 | 0 |
| 265.0 | 0 |
| 264.0 | 0 |
| 263.0 | 0 |
| 262.0 | 0 |
| 261.0 | 0 |
| 260.0 | 0 |
| 259.0 | 0 |
| 258.0 | 0 |
| 257.0 | 0 |
| 256.0 | 0 |
| 255.0 | 0 |
| 254.0 | 0 |
| 253.0 | 0 |
| 252.0 | 0 |
| 251.0 | 0 |
| 250.0 | 0 |
| 249.0 | 0 |
| 248.0 | 0 |
| 247.0 | 0 |
| 246.0 | 0 |
| 245.0 | 0 |
| 244.0 | 0 |
| 243.0 | 0 |
| 242.0 | 0 |
| 241.0 | 0 |
| 240.0 | 0 |
| 239.0 | 0 |
| 238.0 | 0 |
| 237.0 | 0 |
| 236.0 | 0 |
| 235.0 | 0 |
| 234.0 | 0 |
| 233.0 | 0 |
| 232.0 | 0 |
| 231.0 | 0 |
| 230.0 | 0 |
| 229.0 | 0 |
| 228.0 | 0 |
| 227.0 | 0 |
| 226.0 | 0 |
| 225.0 | 0 |
| 224.0 | 0 |
| 223.0 | 0 |
| 222.0 | 0 |
| 221.0 | 0 |
| 220.0 | 0 |
| 219.0 | 0 |
| 218.0 | 0 |
| 217.0 | 0 |
| 216.0 | 0 |
| 215.0 | 0 |
| 214.0 | 0 |
| 213.0 | 0 |
| 212.0 | 0 |
| 211.0 | 0 |
| 210.0 | 0 |
| 209.0 | 0 |
| 208.0 | 0 |
| 207.0 | 0 |
| 206.0 | 0 |
| 205.0 | 0 |
| 204.0 | 0 |
| 203.0 | 0 |
| 202.0 | 0 |
| 201.0 | 0 |